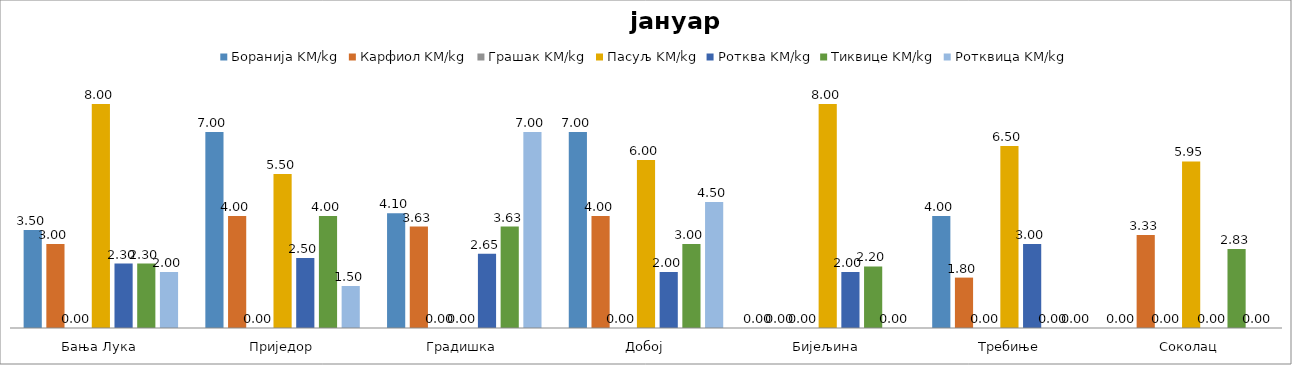
| Category | Боранија KM/kg | Карфиол KM/kg | Грашак KM/kg | Пасуљ KM/kg | Ротква KM/kg | Тиквице KM/kg | Ротквица KM/kg |
|---|---|---|---|---|---|---|---|
| Бања Лука | 3.5 | 3 | 0 | 8 | 2.3 | 2.3 | 2 |
| Приједор | 7 | 4 | 0 | 5.5 | 2.5 | 4 | 1.5 |
| Градишка | 4.1 | 3.625 | 0 | 0 | 2.65 | 3.625 | 7 |
| Добој | 7 | 4 | 0 | 6 | 2 | 3 | 4.5 |
| Бијељина | 0 | 0 | 0 | 8 | 2 | 2.2 | 0 |
|  Требиње | 4 | 1.8 | 0 | 6.5 | 3 | 0 | 0 |
| Соколац | 0 | 3.325 | 0 | 5.95 | 0 | 2.825 | 0 |